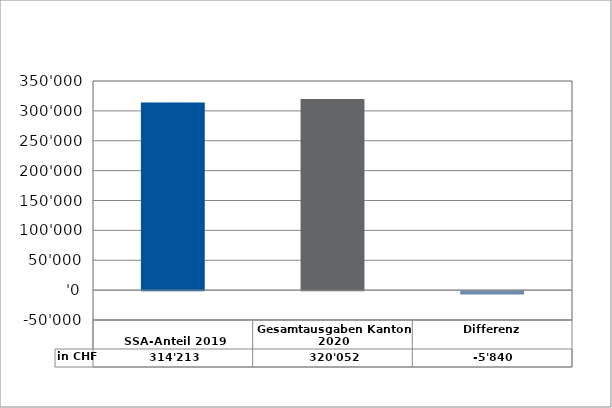
| Category | in CHF |
|---|---|
| 
SSA-Anteil 2019

 | 314212.8 |
| Gesamtausgaben Kanton 2020
 | 320052.4 |
| Differenz | -5839.6 |